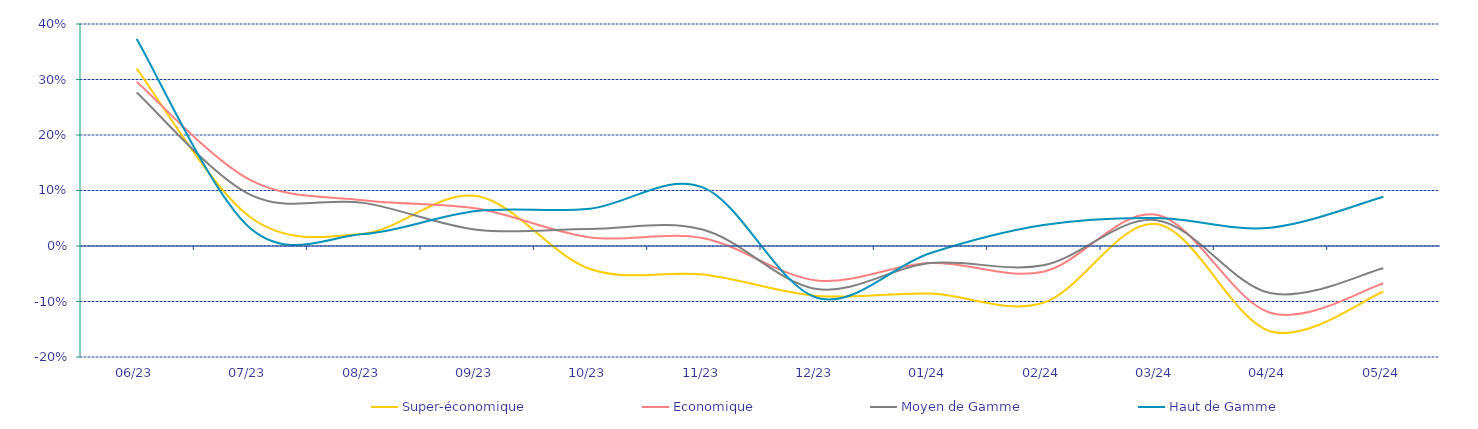
| Category | Super-économique | Economique | Moyen de Gamme | Haut de Gamme |
|---|---|---|---|---|
| 2023-06-01 | 0.32 | 0.296 | 0.277 | 0.373 |
| 2023-07-01 | 0.052 | 0.119 | 0.093 | 0.032 |
| 2023-08-01 | 0.022 | 0.082 | 0.078 | 0.021 |
| 2023-09-01 | 0.09 | 0.067 | 0.029 | 0.063 |
| 2023-10-01 | -0.042 | 0.015 | 0.031 | 0.067 |
| 2023-11-01 | -0.051 | 0.014 | 0.029 | 0.105 |
| 2023-12-01 | -0.09 | -0.062 | -0.077 | -0.093 |
| 2024-01-01 | -0.086 | -0.031 | -0.031 | -0.013 |
| 2024-02-01 | -0.102 | -0.046 | -0.035 | 0.038 |
| 2024-03-01 | 0.04 | 0.056 | 0.047 | 0.05 |
| 2024-04-01 | -0.154 | -0.12 | -0.085 | 0.033 |
| 2024-05-01 | -0.082 | -0.068 | -0.04 | 0.089 |